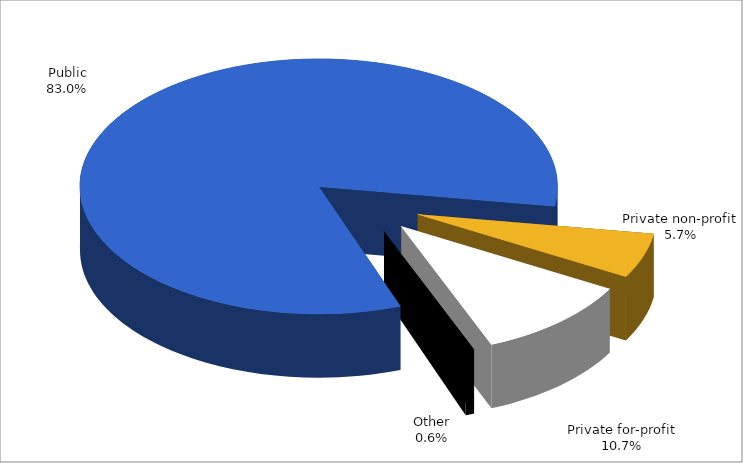
| Category | Series 0 |
|---|---|
| Public | 0.83 |
| Private non-profit | 0.057 |
| Private for-profit | 0.107 |
| Other | 0.006 |